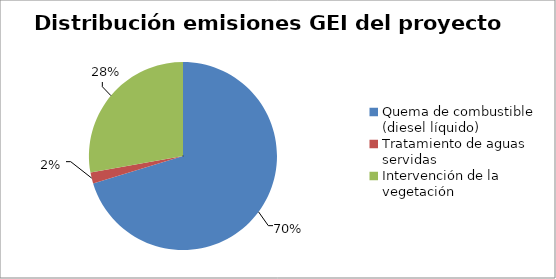
| Category | Series 0 |
|---|---|
| Quema de combustible (diesel líquido) | 16428.171 |
| Tratamiento de aguas servidas | 447.417 |
| Intervención de la vegetación | 6502.149 |